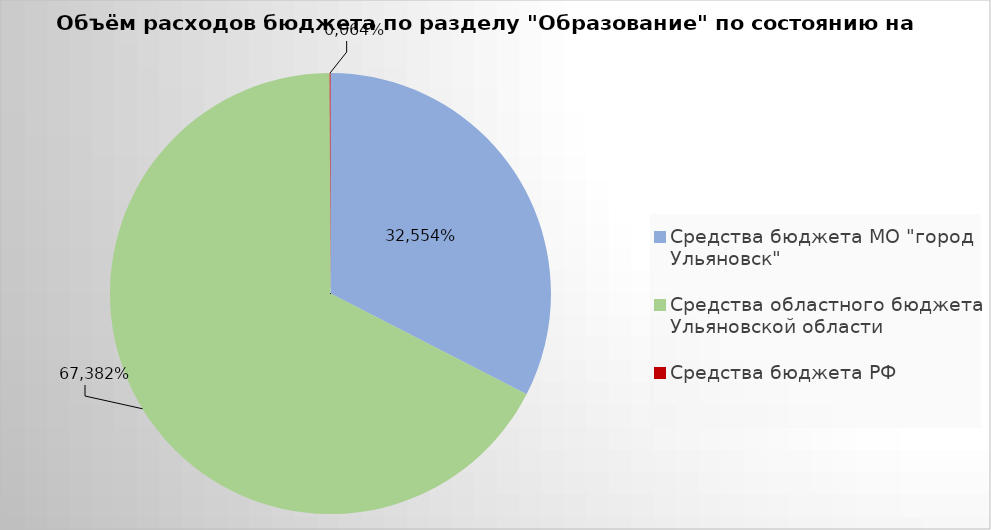
| Category | Series 0 |
|---|---|
| Средства бюджета МО "город Ульяновск" | 1682921.5 |
| Средства областного бюджета Ульяновской области | 3483400.87 |
| Средства бюджета РФ | 3283.27 |